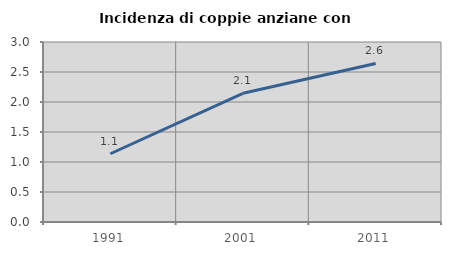
| Category | Incidenza di coppie anziane con figli |
|---|---|
| 1991.0 | 1.138 |
| 2001.0 | 2.145 |
| 2011.0 | 2.642 |